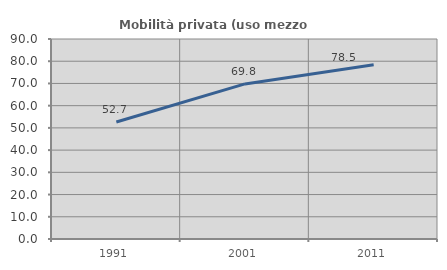
| Category | Mobilità privata (uso mezzo privato) |
|---|---|
| 1991.0 | 52.66 |
| 2001.0 | 69.798 |
| 2011.0 | 78.46 |